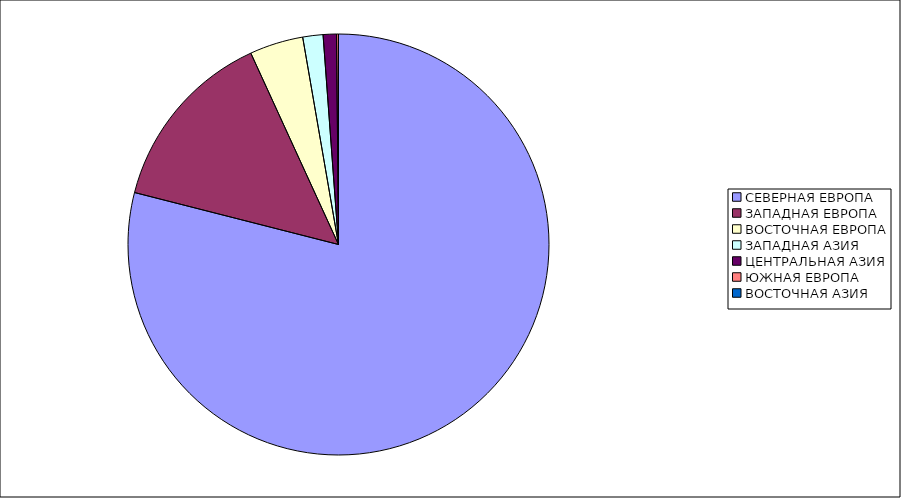
| Category | Оборот |
|---|---|
| СЕВЕРНАЯ ЕВРОПА | 78.971 |
| ЗАПАДНАЯ ЕВРОПА | 14.189 |
| ВОСТОЧНАЯ ЕВРОПА | 4.116 |
| ЗАПАДНАЯ АЗИЯ | 1.554 |
| ЦЕНТРАЛЬНАЯ АЗИЯ | 1.022 |
| ЮЖНАЯ ЕВРОПА | 0.144 |
| ВОСТОЧНАЯ АЗИЯ | 0.003 |